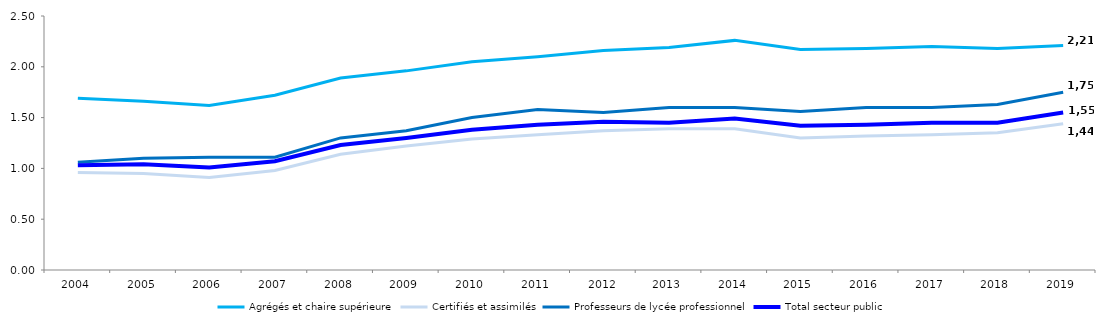
| Category | Agrégés et chaire supérieure | Certifiés et assimilés | Professeurs de lycée professionnel | Total secteur public |
|---|---|---|---|---|
| 2004 | 1.69 | 0.96 | 1.06 | 1.03 |
| 2005 | 1.66 | 0.95 | 1.1 | 1.04 |
| 2006 | 1.62 | 0.91 | 1.11 | 1.01 |
| 2007 | 1.72 | 0.98 | 1.11 | 1.07 |
| 2008 | 1.89 | 1.14 | 1.3 | 1.23 |
| 2009 | 1.96 | 1.22 | 1.37 | 1.3 |
| 2010 | 2.05 | 1.29 | 1.5 | 1.38 |
| 2011 | 2.1 | 1.33 | 1.58 | 1.43 |
| 2012
 | 2.16 | 1.37 | 1.55 | 1.46 |
| 2013 | 2.19 | 1.39 | 1.6 | 1.45 |
| 2014 | 2.26 | 1.39 | 1.6 | 1.49 |
| 2015 | 2.17 | 1.3 | 1.56 | 1.42 |
| 2016 | 2.18 | 1.32 | 1.6 | 1.43 |
| 2017 | 2.2 | 1.33 | 1.6 | 1.45 |
| 2018 | 2.18 | 1.35 | 1.63 | 1.45 |
| 2019 | 2.21 | 1.44 | 1.75 | 1.55 |